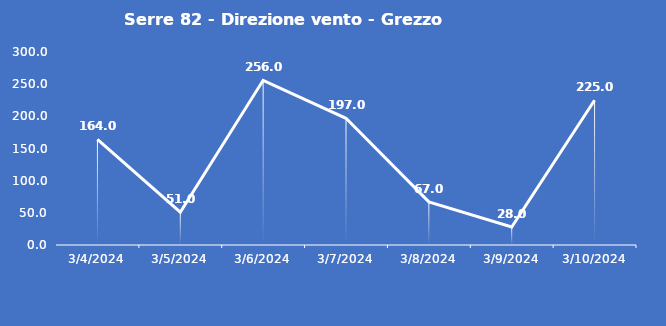
| Category | Serre 82 - Direzione vento - Grezzo (°N) |
|---|---|
| 3/4/24 | 164 |
| 3/5/24 | 51 |
| 3/6/24 | 256 |
| 3/7/24 | 197 |
| 3/8/24 | 67 |
| 3/9/24 | 28 |
| 3/10/24 | 225 |